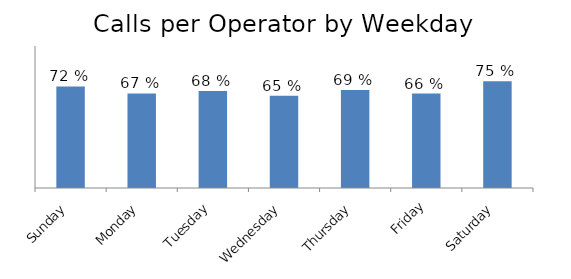
| Category | Total |
|---|---|
| Sunday | 0.715 |
| Monday | 0.666 |
| Tuesday | 0.683 |
| Wednesday | 0.65 |
| Thursday | 0.691 |
| Friday | 0.665 |
| Saturday | 0.752 |